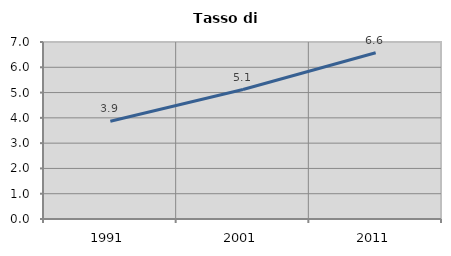
| Category | Tasso di disoccupazione   |
|---|---|
| 1991.0 | 3.869 |
| 2001.0 | 5.12 |
| 2011.0 | 6.574 |